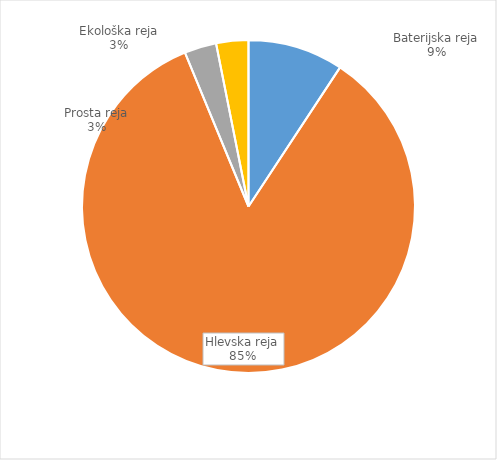
| Category | Količina kosov jajc |
|---|---|
| Baterijska reja | 319627 |
| Hlevska reja | 2915156 |
| Prosta reja | 107287 |
| Ekološka reja | 107820 |